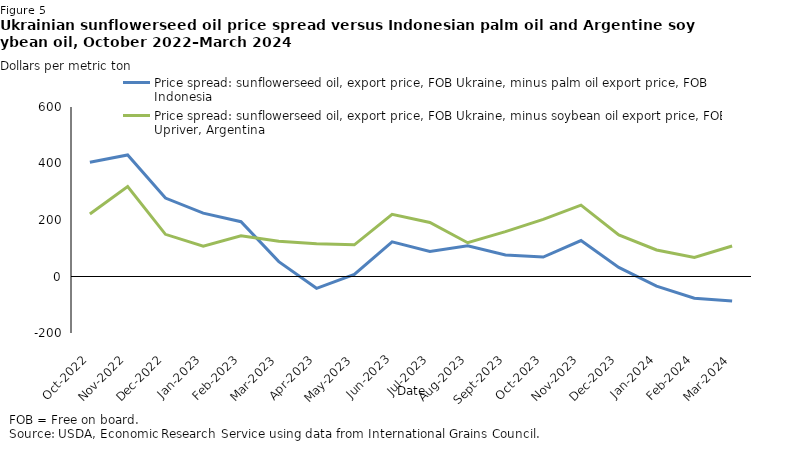
| Category | Price spread: sunflowerseed oil, export price, FOB Ukraine, minus palm oil export price, FOB Indonesia | Price spread: sunflowerseed oil, export price, FOB Ukraine, minus soybean oil export price, FOB Upriver, Argentina |
|---|---|---|
| 2022-10-01 | 404.281 | 221.186 |
| 2022-11-01 | 430.273 | 318.568 |
| 2022-12-01 | 277.5 | 149.318 |
| 2023-01-01 | 224.227 | 107.636 |
| 2023-02-01 | 194.1 | 144.35 |
| 2023-03-01 | 52.609 | 124.652 |
| 2023-04-01 | -41.9 | 115.6 |
| 2023-05-01 | 7.087 | 112.087 |
| 2023-06-01 | 122.792 | 219.929 |
| 2023-07-01 | 88.571 | 191.19 |
| 2023-08-01 | 108.696 | 119.565 |
| 2023-09-01 | 76.476 | 158.714 |
| 2023-10-01 | 69 | 202.455 |
| 2023-11-01 | 127.409 | 252.409 |
| 2023-12-01 | 32.381 | 147.143 |
| 2024-01-01 | -34.304 | 93.957 |
| 2024-02-01 | -77.05 | 67.7 |
| 2024-03-01 | -86.579 | 108.158 |